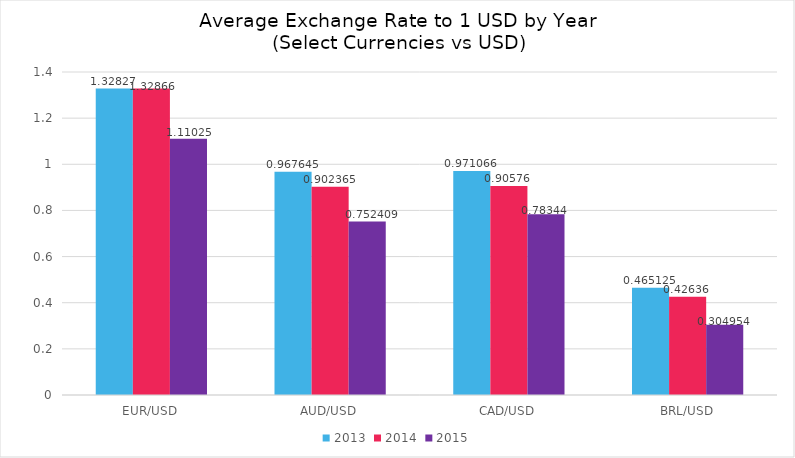
| Category | 2013 | 2014 | 2015 |
|---|---|---|---|
| EUR/USD | 1.328 | 1.329 | 1.11 |
| AUD/USD | 0.968 | 0.902 | 0.752 |
| CAD/USD | 0.971 | 0.906 | 0.783 |
| BRL/USD | 0.465 | 0.426 | 0.305 |